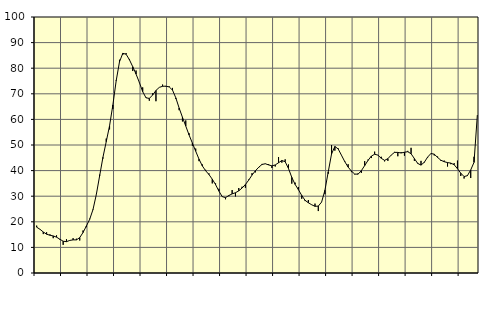
| Category | Piggar | Series 1 |
|---|---|---|
| nan | 18.5 | 17.9 |
| 87.0 | 17.1 | 17.07 |
| 87.0 | 15.2 | 16.02 |
| 87.0 | 15.9 | 15.16 |
| nan | 15.1 | 14.74 |
| 88.0 | 13.6 | 14.48 |
| 88.0 | 14.7 | 14 |
| 88.0 | 13 | 13.2 |
| nan | 11 | 12.41 |
| 89.0 | 13.2 | 12.24 |
| 89.0 | 12.7 | 12.73 |
| 89.0 | 13.6 | 12.94 |
| nan | 13.4 | 12.93 |
| 90.0 | 12.7 | 13.82 |
| 90.0 | 16.6 | 15.82 |
| 90.0 | 17.9 | 18.33 |
| nan | 21.2 | 20.95 |
| 91.0 | 24.6 | 24.78 |
| 91.0 | 30.7 | 30.62 |
| 91.0 | 38.4 | 37.9 |
| nan | 44.7 | 45.17 |
| 92.0 | 52.5 | 51.31 |
| 92.0 | 56.1 | 57.49 |
| 92.0 | 64.1 | 65.64 |
| nan | 75.3 | 75.07 |
| 93.0 | 83.3 | 82.49 |
| 93.0 | 85.2 | 85.81 |
| 93.0 | 85.9 | 85.46 |
| nan | 83.6 | 83.3 |
| 94.0 | 78.9 | 80.58 |
| 94.0 | 79.1 | 77.7 |
| 94.0 | 74.3 | 74.43 |
| nan | 72.5 | 70.84 |
| 95.0 | 68.6 | 68.44 |
| 95.0 | 67.3 | 68.19 |
| 95.0 | 70.2 | 69.52 |
| nan | 67.1 | 71.3 |
| 96.0 | 72.5 | 72.5 |
| 96.0 | 73.6 | 72.93 |
| 96.0 | 72.8 | 72.99 |
| nan | 72.9 | 72.68 |
| 97.0 | 72.3 | 71.45 |
| 97.0 | 68 | 68.41 |
| 97.0 | 63.6 | 64.45 |
| nan | 59.2 | 60.84 |
| 98.0 | 59.6 | 57.4 |
| 98.0 | 54.6 | 53.92 |
| 98.0 | 49.7 | 50.76 |
| nan | 48.6 | 47.58 |
| 99.0 | 43.7 | 44.48 |
| 99.0 | 42.4 | 41.83 |
| 99.0 | 40.3 | 39.93 |
| nan | 38.9 | 38.46 |
| 0.0 | 35 | 36.65 |
| 0.0 | 35 | 34.51 |
| 0.0 | 32.9 | 31.99 |
| nan | 29.7 | 29.83 |
| 1.0 | 28.8 | 29.45 |
| 1.0 | 30 | 30.26 |
| 1.0 | 32.4 | 30.92 |
| nan | 29.9 | 31.35 |
| 2.0 | 33.2 | 32.09 |
| 2.0 | 33.7 | 33.19 |
| 2.0 | 33.3 | 34.56 |
| nan | 36.5 | 36.28 |
| 3.0 | 39 | 38.24 |
| 3.0 | 39.3 | 39.9 |
| 3.0 | 41.1 | 41.29 |
| nan | 42.6 | 42.4 |
| 4.0 | 42.6 | 42.67 |
| 4.0 | 42.5 | 42.22 |
| 4.0 | 41 | 41.86 |
| nan | 41.6 | 42.21 |
| 5.0 | 45.3 | 43.07 |
| 5.0 | 43.1 | 43.94 |
| 5.0 | 44.4 | 43.48 |
| nan | 42.4 | 40.83 |
| 6.0 | 34.9 | 37.36 |
| 6.0 | 35.3 | 34.61 |
| 6.0 | 33.6 | 32.54 |
| nan | 29 | 30.3 |
| 7.0 | 28.1 | 28.4 |
| 7.0 | 28.5 | 27.44 |
| 7.0 | 26.6 | 26.66 |
| nan | 27.1 | 26.05 |
| 8.0 | 24.2 | 26.13 |
| 8.0 | 27.7 | 27.72 |
| 8.0 | 30.8 | 32.32 |
| nan | 38.8 | 39.52 |
| 9.0 | 50 | 46.51 |
| 9.0 | 47.8 | 49.43 |
| 9.0 | 48.7 | 48.46 |
| nan | 45.9 | 45.98 |
| 10.0 | 43.7 | 43.47 |
| 10.0 | 42.5 | 41.37 |
| 10.0 | 39.4 | 39.8 |
| nan | 38.5 | 38.65 |
| 11.0 | 38.9 | 38.6 |
| 11.0 | 39.1 | 39.99 |
| 11.0 | 43.7 | 41.96 |
| nan | 44.3 | 43.97 |
| 12.0 | 44.9 | 45.66 |
| 12.0 | 47.4 | 46.39 |
| 12.0 | 46.1 | 46.05 |
| nan | 45.4 | 44.8 |
| 13.0 | 43.6 | 44 |
| 13.0 | 43.8 | 44.66 |
| 13.0 | 46.1 | 46.06 |
| nan | 47.3 | 47.12 |
| 14.0 | 45.6 | 47.11 |
| 14.0 | 47.2 | 46.88 |
| 14.0 | 45.8 | 47.18 |
| nan | 47.7 | 47.38 |
| 15.0 | 48.9 | 46.58 |
| 15.0 | 43.8 | 44.7 |
| 15.0 | 43 | 42.81 |
| nan | 43.8 | 42.14 |
| 16.0 | 43.1 | 43.28 |
| 16.0 | 45.1 | 45.29 |
| 16.0 | 46.8 | 46.68 |
| nan | 45.9 | 46.41 |
| 17.0 | 45.5 | 45.15 |
| 17.0 | 43.8 | 44.04 |
| 17.0 | 43.9 | 43.48 |
| nan | 41.6 | 43.13 |
| 18.0 | 42.5 | 42.93 |
| 18.0 | 42.9 | 42.29 |
| 18.0 | 43.9 | 40.74 |
| nan | 37.9 | 38.99 |
| 19.0 | 36.9 | 37.68 |
| 19.0 | 38.2 | 38.01 |
| 19.0 | 37.1 | 40.26 |
| nan | 45.4 | 43.23 |
| 20.0 | 61.7 | 61.68 |